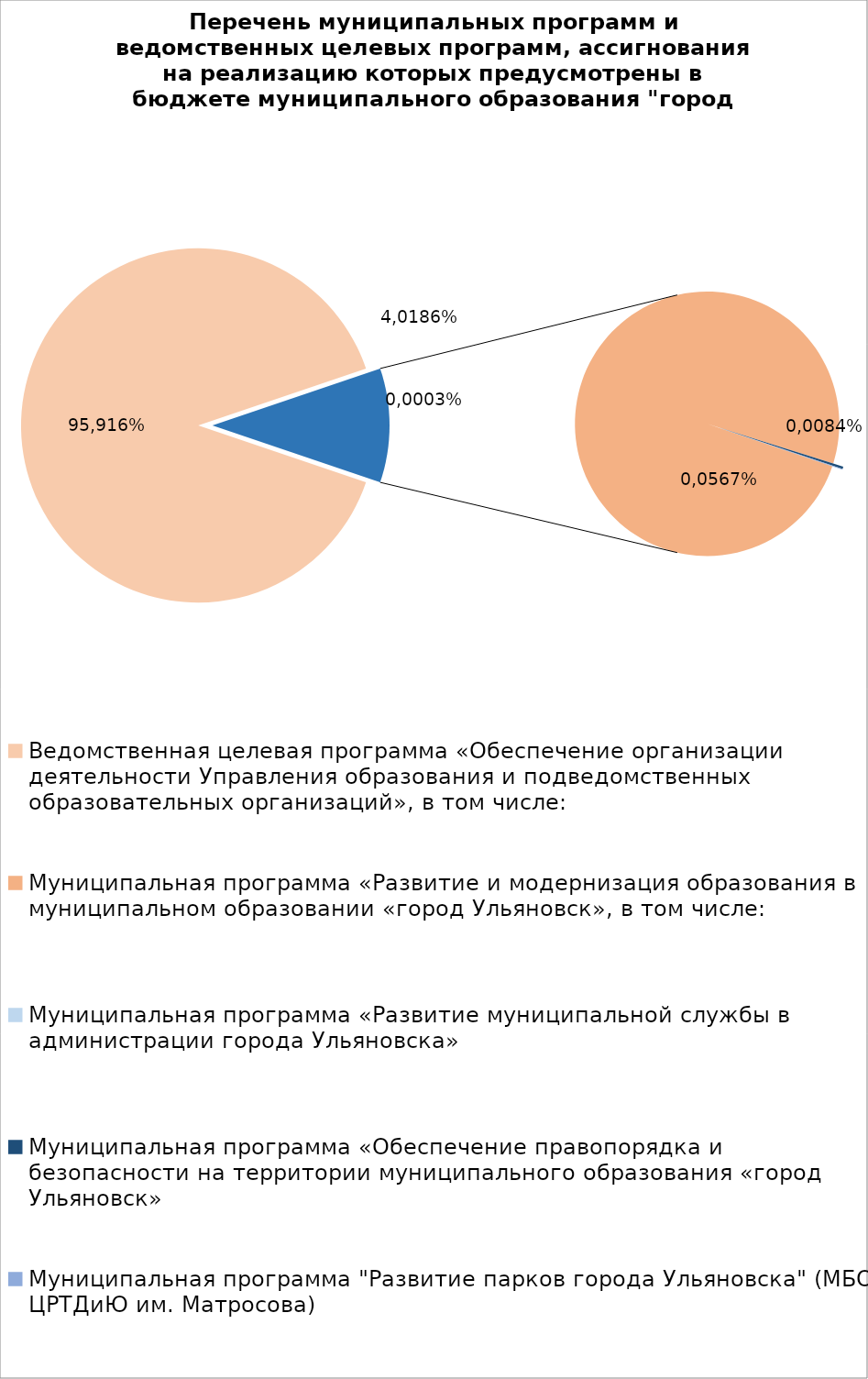
| Category | Series 0 |
|---|---|
| Ведомственная целевая программа «Обеспечение организации деятельности Управления образования и подведомственных образовательных организаций», в том числе: | 7863736.86 |
| Муниципальная программа «Развитие и модернизация образования в муниципальном образовании «город Ульяновск», в том числе: | 910463 |
| Муниципальная программа «Развитие муниципальной службы в администрации города Ульяновска» | 14.3 |
| Муниципальная программа «Обеспечение правопорядка и безопасности на территории муниципального образования «город Ульяновск» | 2700 |
| Муниципальная программа "Развитие парков города Ульяновска" (МБОУ ЦРТДиЮ им. Матросова) | 600 |